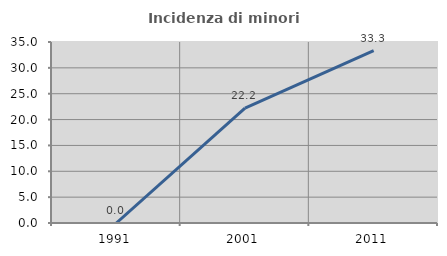
| Category | Incidenza di minori stranieri |
|---|---|
| 1991.0 | 0 |
| 2001.0 | 22.222 |
| 2011.0 | 33.333 |